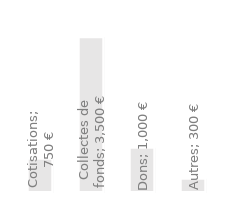
| Category | Revenus annuels |
|---|---|
| Cotisations | 750 |
| Collectes de fonds | 3500 |
| Dons | 1000 |
| Autres | 300 |